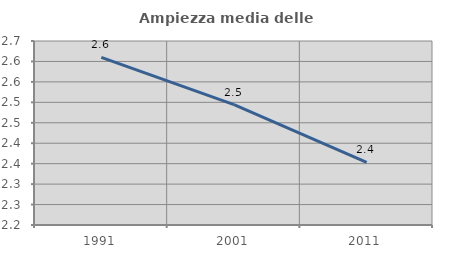
| Category | Ampiezza media delle famiglie |
|---|---|
| 1991.0 | 2.61 |
| 2001.0 | 2.495 |
| 2011.0 | 2.353 |